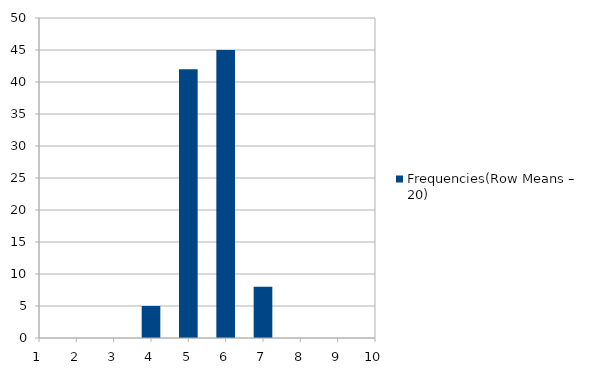
| Category | Frequencies(Row Means – 20) |
|---|---|
| 0 | 0 |
| 1 | 0 |
| 2 | 0 |
| 3 | 5 |
| 4 | 42 |
| 5 | 45 |
| 6 | 8 |
| 7 | 0 |
| 8 | 0 |
| 9 | 0 |